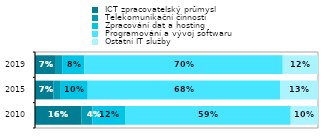
| Category |  ICT zpracovatelský průmysl |  Telekomunikační činnosti  |  Zpracování dat a hosting |  Programování a vývoj softwaru |  Ostatní IT služby  |
|---|---|---|---|---|---|
| 2010.0 | 0.164 | 0.038 | 0.115 | 0.585 | 0.096 |
| 2015.0 | 0.065 | 0.026 | 0.095 | 0.68 | 0.134 |
| 2019.0 | 0.074 | 0.022 | 0.078 | 0.701 | 0.125 |